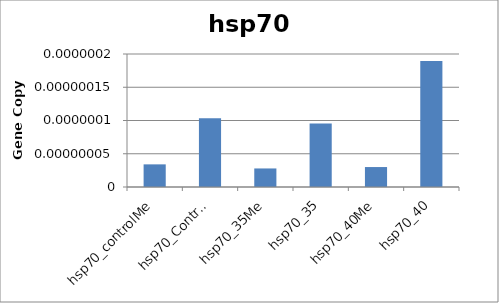
| Category | hsp70 |
|---|---|
| hsp70_controlMe | 0 |
| hsp70_Control | 0 |
| hsp70_35Me | 0 |
| hsp70_35 | 0 |
| hsp70_40Me | 0 |
| hsp70_40 | 0 |